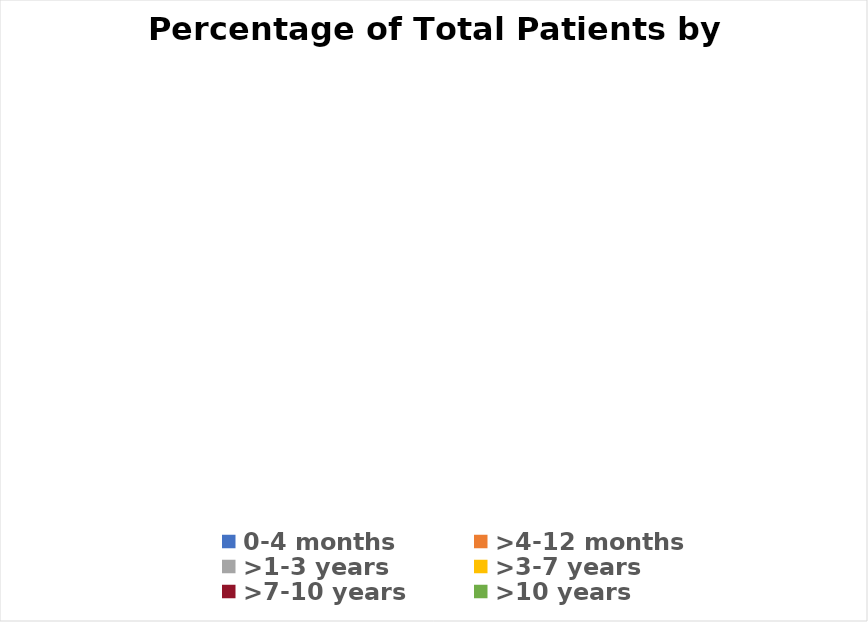
| Category | Series 0 |
|---|---|
| 0-4 months | 0 |
| >4-12 months | 0 |
| >1-3 years | 0 |
| >3-7 years | 0 |
| >7-10 years | 0 |
| >10 years | 0 |